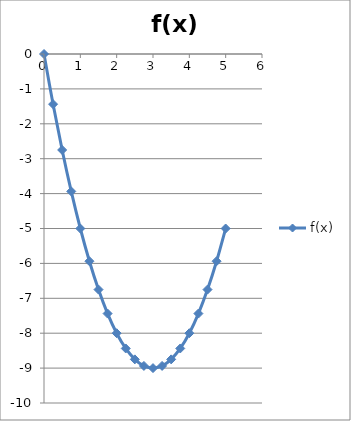
| Category | f(x) |
|---|---|
| 0.0 | 0 |
| 0.25 | -1.438 |
| 0.5 | -2.75 |
| 0.75 | -3.938 |
| 1.0 | -5 |
| 1.25 | -5.938 |
| 1.5 | -6.75 |
| 1.75 | -7.438 |
| 2.0 | -8 |
| 2.25 | -8.438 |
| 2.5 | -8.75 |
| 2.75 | -8.938 |
| 3.0 | -9 |
| 3.25 | -8.938 |
| 3.5 | -8.75 |
| 3.75 | -8.438 |
| 4.0 | -8 |
| 4.25 | -7.438 |
| 4.5 | -6.75 |
| 4.75 | -5.938 |
| 5.0 | -5 |